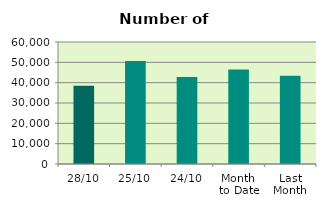
| Category | Series 0 |
|---|---|
| 28/10 | 38508 |
| 25/10 | 50648 |
| 24/10 | 42824 |
| Month 
to Date | 46420 |
| Last
Month | 43452.667 |